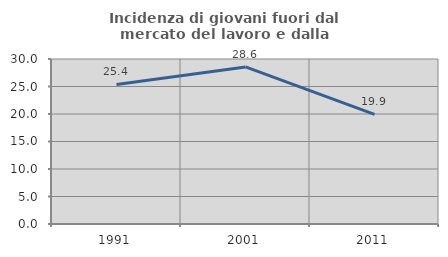
| Category | Incidenza di giovani fuori dal mercato del lavoro e dalla formazione  |
|---|---|
| 1991.0 | 25.382 |
| 2001.0 | 28.553 |
| 2011.0 | 19.944 |